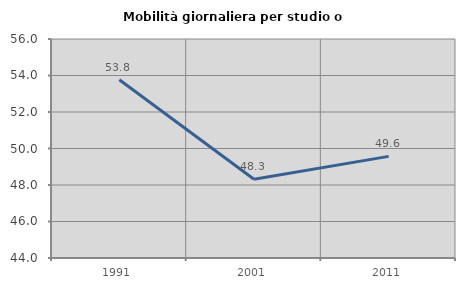
| Category | Mobilità giornaliera per studio o lavoro |
|---|---|
| 1991.0 | 53.769 |
| 2001.0 | 48.316 |
| 2011.0 | 49.569 |